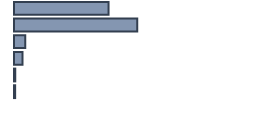
| Category | Percentatge |
|---|---|
| 0 | 39.391 |
| 1 | 51.348 |
| 2 | 4.696 |
| 3 | 3.565 |
| 4 | 0.522 |
| 5 | 0.478 |